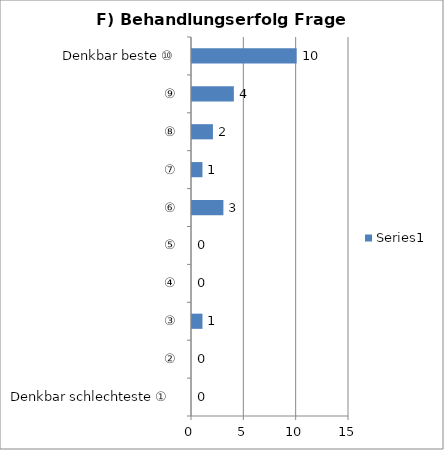
| Category | Series 0 |
|---|---|
| Denkbar schlechteste ①  | 0 |
| ② | 0 |
| ③ | 1 |
| ④ | 0 |
| ⑤ | 0 |
| ⑥ | 3 |
| ⑦ | 1 |
| ⑧ | 2 |
| ⑨ | 4 |
| Denkbar beste ⑩ | 10 |